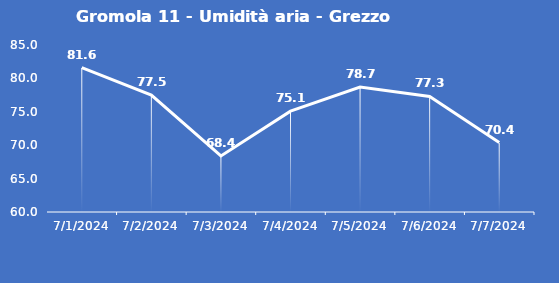
| Category | Gromola 11 - Umidità aria - Grezzo (%) |
|---|---|
| 7/1/24 | 81.6 |
| 7/2/24 | 77.5 |
| 7/3/24 | 68.4 |
| 7/4/24 | 75.1 |
| 7/5/24 | 78.7 |
| 7/6/24 | 77.3 |
| 7/7/24 | 70.4 |